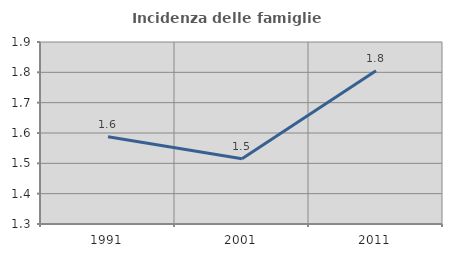
| Category | Incidenza delle famiglie numerose |
|---|---|
| 1991.0 | 1.587 |
| 2001.0 | 1.515 |
| 2011.0 | 1.805 |